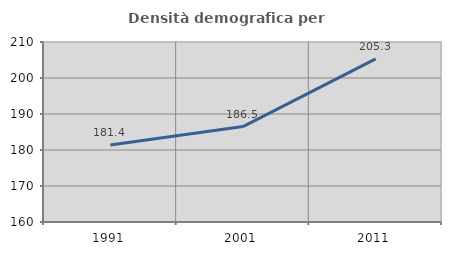
| Category | Densità demografica |
|---|---|
| 1991.0 | 181.389 |
| 2001.0 | 186.514 |
| 2011.0 | 205.303 |